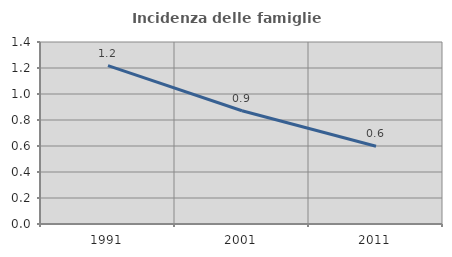
| Category | Incidenza delle famiglie numerose |
|---|---|
| 1991.0 | 1.218 |
| 2001.0 | 0.871 |
| 2011.0 | 0.598 |